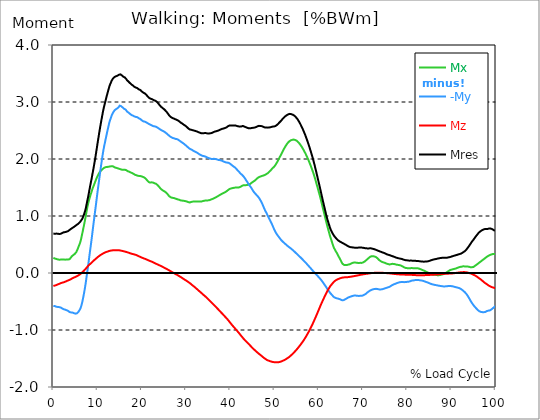
| Category |  Mx |  -My |  Mz |  Mres |
|---|---|---|---|---|
| 0.0 | 0.266 | -0.577 | -0.228 | 0.693 |
| 0.167348456675344 | 0.259 | -0.575 | -0.224 | 0.686 |
| 0.334696913350688 | 0.253 | -0.58 | -0.22 | 0.688 |
| 0.5020453700260321 | 0.25 | -0.586 | -0.216 | 0.69 |
| 0.669393826701376 | 0.247 | -0.592 | -0.211 | 0.692 |
| 0.83674228337672 | 0.243 | -0.594 | -0.206 | 0.691 |
| 1.0040907400520642 | 0.239 | -0.596 | -0.2 | 0.689 |
| 1.1621420602454444 | 0.233 | -0.599 | -0.196 | 0.688 |
| 1.3294905169207885 | 0.233 | -0.599 | -0.19 | 0.684 |
| 1.4968389735961325 | 0.235 | -0.601 | -0.183 | 0.685 |
| 1.6641874302714765 | 0.235 | -0.605 | -0.178 | 0.688 |
| 1.8315358869468206 | 0.235 | -0.612 | -0.174 | 0.693 |
| 1.9988843436221646 | 0.239 | -0.622 | -0.17 | 0.702 |
| 2.1662328002975086 | 0.236 | -0.63 | -0.168 | 0.708 |
| 2.333581256972853 | 0.235 | -0.636 | -0.164 | 0.714 |
| 2.5009297136481967 | 0.234 | -0.64 | -0.158 | 0.716 |
| 2.6682781703235405 | 0.234 | -0.643 | -0.153 | 0.718 |
| 2.8356266269988843 | 0.234 | -0.648 | -0.147 | 0.721 |
| 3.002975083674229 | 0.235 | -0.653 | -0.142 | 0.725 |
| 3.1703235403495724 | 0.239 | -0.657 | -0.135 | 0.729 |
| 3.337671997024917 | 0.237 | -0.665 | -0.13 | 0.735 |
| 3.4957233172182973 | 0.233 | -0.678 | -0.126 | 0.745 |
| 3.663071773893641 | 0.243 | -0.685 | -0.12 | 0.755 |
| 3.8304202305689854 | 0.259 | -0.689 | -0.112 | 0.766 |
| 3.997768687244329 | 0.275 | -0.692 | -0.106 | 0.775 |
| 4.165117143919673 | 0.293 | -0.693 | -0.099 | 0.784 |
| 4.332465600595017 | 0.304 | -0.695 | -0.092 | 0.793 |
| 4.499814057270361 | 0.314 | -0.698 | -0.085 | 0.799 |
| 4.667162513945706 | 0.323 | -0.705 | -0.079 | 0.809 |
| 4.834510970621049 | 0.334 | -0.709 | -0.074 | 0.819 |
| 5.001859427296393 | 0.349 | -0.714 | -0.069 | 0.829 |
| 5.169207883971737 | 0.365 | -0.715 | -0.062 | 0.839 |
| 5.336556340647081 | 0.392 | -0.707 | -0.056 | 0.848 |
| 5.503904797322425 | 0.422 | -0.696 | -0.049 | 0.856 |
| 5.671253253997769 | 0.455 | -0.68 | -0.041 | 0.866 |
| 5.82930457419115 | 0.489 | -0.664 | -0.032 | 0.879 |
| 5.996653030866494 | 0.522 | -0.641 | -0.024 | 0.892 |
| 6.164001487541838 | 0.562 | -0.614 | -0.015 | 0.908 |
| 6.331349944217181 | 0.62 | -0.571 | -0.004 | 0.927 |
| 6.498698400892526 | 0.68 | -0.522 | 0.008 | 0.946 |
| 6.66604685756787 | 0.741 | -0.463 | 0.022 | 0.975 |
| 6.833395314243213 | 0.804 | -0.396 | 0.035 | 1.007 |
| 7.000743770918558 | 0.868 | -0.326 | 0.048 | 1.045 |
| 7.168092227593902 | 0.933 | -0.249 | 0.061 | 1.088 |
| 7.335440684269246 | 1.003 | -0.166 | 0.076 | 1.136 |
| 7.50278914094459 | 1.077 | -0.072 | 0.092 | 1.201 |
| 7.6701375976199335 | 1.148 | 0.021 | 0.107 | 1.266 |
| 7.837486054295278 | 1.207 | 0.114 | 0.122 | 1.325 |
| 7.995537374488658 | 1.26 | 0.211 | 0.136 | 1.392 |
| 8.162885831164003 | 1.308 | 0.312 | 0.149 | 1.464 |
| 8.330234287839346 | 1.352 | 0.408 | 0.159 | 1.531 |
| 8.49758274451469 | 1.393 | 0.505 | 0.171 | 1.597 |
| 8.664931201190035 | 1.431 | 0.606 | 0.182 | 1.662 |
| 8.832279657865378 | 1.475 | 0.711 | 0.196 | 1.734 |
| 8.999628114540721 | 1.509 | 0.818 | 0.208 | 1.803 |
| 9.166976571216066 | 1.541 | 0.92 | 0.221 | 1.876 |
| 9.334325027891412 | 1.575 | 1.021 | 0.232 | 1.952 |
| 9.501673484566755 | 1.61 | 1.121 | 0.244 | 2.029 |
| 9.669021941242098 | 1.643 | 1.223 | 0.254 | 2.111 |
| 9.836370397917442 | 1.674 | 1.328 | 0.266 | 2.196 |
| 10.003718854592787 | 1.702 | 1.431 | 0.277 | 2.28 |
| 10.17106731126813 | 1.727 | 1.529 | 0.286 | 2.361 |
| 10.329118631461512 | 1.751 | 1.626 | 0.297 | 2.442 |
| 10.496467088136853 | 1.773 | 1.724 | 0.306 | 2.521 |
| 10.663815544812199 | 1.79 | 1.819 | 0.316 | 2.597 |
| 10.831164001487544 | 1.802 | 1.91 | 0.323 | 2.67 |
| 10.998512458162887 | 1.814 | 1.998 | 0.331 | 2.741 |
| 11.16586091483823 | 1.825 | 2.084 | 0.34 | 2.81 |
| 11.333209371513574 | 1.838 | 2.162 | 0.347 | 2.875 |
| 11.50055782818892 | 1.847 | 2.229 | 0.354 | 2.931 |
| 11.667906284864264 | 1.853 | 2.292 | 0.359 | 2.983 |
| 11.835254741539607 | 1.857 | 2.353 | 0.365 | 3.035 |
| 12.00260319821495 | 1.859 | 2.414 | 0.37 | 3.084 |
| 12.169951654890292 | 1.86 | 2.474 | 0.374 | 3.134 |
| 12.337300111565641 | 1.862 | 2.531 | 0.378 | 3.181 |
| 12.504648568240984 | 1.865 | 2.589 | 0.383 | 3.228 |
| 12.662699888434362 | 1.868 | 2.643 | 0.388 | 3.274 |
| 12.830048345109708 | 1.87 | 2.685 | 0.391 | 3.309 |
| 12.997396801785053 | 1.873 | 2.72 | 0.394 | 3.339 |
| 13.164745258460396 | 1.873 | 2.76 | 0.396 | 3.372 |
| 13.33209371513574 | 1.874 | 2.786 | 0.397 | 3.394 |
| 13.499442171811083 | 1.871 | 2.815 | 0.398 | 3.415 |
| 13.666790628486426 | 1.862 | 2.834 | 0.399 | 3.428 |
| 13.834139085161771 | 1.854 | 2.854 | 0.4 | 3.44 |
| 14.001487541837117 | 1.85 | 2.864 | 0.4 | 3.445 |
| 14.16883599851246 | 1.846 | 2.874 | 0.401 | 3.451 |
| 14.336184455187803 | 1.841 | 2.886 | 0.401 | 3.458 |
| 14.503532911863147 | 1.839 | 2.892 | 0.4 | 3.462 |
| 14.670881368538492 | 1.832 | 2.898 | 0.398 | 3.464 |
| 14.828932688731873 | 1.829 | 2.917 | 0.398 | 3.478 |
| 14.996281145407215 | 1.827 | 2.936 | 0.397 | 3.494 |
| 15.163629602082558 | 1.821 | 2.931 | 0.395 | 3.485 |
| 15.330978058757903 | 1.814 | 2.926 | 0.392 | 3.477 |
| 15.498326515433247 | 1.812 | 2.916 | 0.389 | 3.467 |
| 15.665674972108594 | 1.81 | 2.904 | 0.385 | 3.455 |
| 15.833023428783937 | 1.81 | 2.891 | 0.382 | 3.443 |
| 16.00037188545928 | 1.811 | 2.879 | 0.379 | 3.432 |
| 16.167720342134626 | 1.811 | 2.876 | 0.376 | 3.43 |
| 16.335068798809967 | 1.809 | 2.868 | 0.373 | 3.421 |
| 16.502417255485312 | 1.803 | 2.85 | 0.369 | 3.401 |
| 16.669765712160658 | 1.794 | 2.832 | 0.365 | 3.381 |
| 16.837114168836 | 1.785 | 2.824 | 0.361 | 3.369 |
| 17.004462625511344 | 1.782 | 2.814 | 0.356 | 3.357 |
| 17.16251394570472 | 1.777 | 2.803 | 0.352 | 3.346 |
| 17.32986240238007 | 1.771 | 2.792 | 0.347 | 3.331 |
| 17.497210859055414 | 1.764 | 2.778 | 0.342 | 3.316 |
| 17.664559315730756 | 1.758 | 2.772 | 0.339 | 3.306 |
| 17.8319077724061 | 1.752 | 2.769 | 0.335 | 3.3 |
| 17.999256229081443 | 1.747 | 2.76 | 0.332 | 3.289 |
| 18.166604685756788 | 1.738 | 2.753 | 0.329 | 3.277 |
| 18.333953142432133 | 1.727 | 2.747 | 0.325 | 3.266 |
| 18.501301599107478 | 1.722 | 2.742 | 0.322 | 3.258 |
| 18.668650055782823 | 1.718 | 2.738 | 0.318 | 3.252 |
| 18.835998512458165 | 1.714 | 2.742 | 0.312 | 3.253 |
| 19.00334696913351 | 1.708 | 2.733 | 0.306 | 3.243 |
| 19.170695425808855 | 1.704 | 2.723 | 0.3 | 3.231 |
| 19.338043882484197 | 1.701 | 2.714 | 0.294 | 3.221 |
| 19.496095202677576 | 1.703 | 2.708 | 0.288 | 3.217 |
| 19.66344365935292 | 1.702 | 2.701 | 0.281 | 3.21 |
| 19.830792116028263 | 1.698 | 2.691 | 0.275 | 3.199 |
| 19.998140572703612 | 1.693 | 2.678 | 0.27 | 3.184 |
| 20.165489029378953 | 1.689 | 2.668 | 0.265 | 3.174 |
| 20.3328374860543 | 1.683 | 2.66 | 0.259 | 3.165 |
| 20.500185942729644 | 1.678 | 2.658 | 0.255 | 3.158 |
| 20.667534399404985 | 1.671 | 2.655 | 0.25 | 3.151 |
| 20.83488285608033 | 1.659 | 2.653 | 0.245 | 3.143 |
| 21.002231312755672 | 1.645 | 2.644 | 0.24 | 3.127 |
| 21.16957976943102 | 1.629 | 2.635 | 0.233 | 3.111 |
| 21.336928226106362 | 1.614 | 2.627 | 0.228 | 3.097 |
| 21.504276682781704 | 1.6 | 2.619 | 0.222 | 3.082 |
| 21.67162513945705 | 1.591 | 2.611 | 0.217 | 3.071 |
| 21.82967645965043 | 1.586 | 2.605 | 0.211 | 3.062 |
| 21.997024916325774 | 1.585 | 2.599 | 0.206 | 3.057 |
| 22.16437337300112 | 1.591 | 2.593 | 0.201 | 3.054 |
| 22.33172182967646 | 1.594 | 2.586 | 0.196 | 3.049 |
| 22.499070286351806 | 1.588 | 2.578 | 0.19 | 3.039 |
| 22.666418743027148 | 1.581 | 2.575 | 0.183 | 3.033 |
| 22.833767199702496 | 1.576 | 2.573 | 0.177 | 3.028 |
| 23.00111565637784 | 1.572 | 2.571 | 0.171 | 3.024 |
| 23.168464113053183 | 1.567 | 2.568 | 0.165 | 3.019 |
| 23.335812569728528 | 1.557 | 2.561 | 0.158 | 3.008 |
| 23.50316102640387 | 1.547 | 2.554 | 0.152 | 2.995 |
| 23.670509483079215 | 1.533 | 2.545 | 0.147 | 2.98 |
| 23.83785793975456 | 1.519 | 2.536 | 0.141 | 2.965 |
| 23.995909259947936 | 1.502 | 2.527 | 0.134 | 2.948 |
| 24.163257716623285 | 1.488 | 2.518 | 0.128 | 2.932 |
| 24.330606173298627 | 1.473 | 2.509 | 0.123 | 2.918 |
| 24.49795462997397 | 1.462 | 2.503 | 0.116 | 2.906 |
| 24.665303086649313 | 1.453 | 2.497 | 0.109 | 2.896 |
| 24.83265154332466 | 1.445 | 2.49 | 0.102 | 2.884 |
| 25.0 | 1.439 | 2.483 | 0.096 | 2.876 |
| 25.167348456675345 | 1.43 | 2.475 | 0.09 | 2.865 |
| 25.334696913350694 | 1.42 | 2.465 | 0.082 | 2.85 |
| 25.502045370026035 | 1.409 | 2.454 | 0.076 | 2.835 |
| 25.669393826701377 | 1.397 | 2.444 | 0.069 | 2.821 |
| 25.836742283376722 | 1.382 | 2.432 | 0.061 | 2.803 |
| 26.004090740052067 | 1.366 | 2.421 | 0.054 | 2.785 |
| 26.17143919672741 | 1.349 | 2.409 | 0.047 | 2.766 |
| 26.329490516920792 | 1.336 | 2.398 | 0.04 | 2.75 |
| 26.49683897359613 | 1.33 | 2.389 | 0.031 | 2.74 |
| 26.66418743027148 | 1.324 | 2.382 | 0.024 | 2.73 |
| 26.831535886946828 | 1.32 | 2.375 | 0.017 | 2.723 |
| 26.998884343622166 | 1.318 | 2.369 | 0.008 | 2.717 |
| 27.166232800297514 | 1.317 | 2.365 | 0.001 | 2.711 |
| 27.333581256972852 | 1.312 | 2.361 | -0.005 | 2.706 |
| 27.5009297136482 | 1.308 | 2.357 | -0.014 | 2.7 |
| 27.668278170323543 | 1.306 | 2.351 | -0.021 | 2.694 |
| 27.835626626998888 | 1.299 | 2.35 | -0.026 | 2.689 |
| 28.002975083674233 | 1.295 | 2.348 | -0.033 | 2.684 |
| 28.170323540349575 | 1.291 | 2.342 | -0.041 | 2.677 |
| 28.33767199702492 | 1.286 | 2.332 | -0.049 | 2.668 |
| 28.50502045370026 | 1.283 | 2.323 | -0.057 | 2.658 |
| 28.663071773893645 | 1.278 | 2.314 | -0.065 | 2.648 |
| 28.830420230568986 | 1.272 | 2.304 | -0.073 | 2.636 |
| 28.99776868724433 | 1.27 | 2.295 | -0.081 | 2.628 |
| 29.165117143919673 | 1.27 | 2.285 | -0.091 | 2.621 |
| 29.33246560059502 | 1.273 | 2.277 | -0.099 | 2.615 |
| 29.499814057270367 | 1.267 | 2.265 | -0.107 | 2.601 |
| 29.66716251394571 | 1.264 | 2.257 | -0.116 | 2.594 |
| 29.834510970621054 | 1.261 | 2.248 | -0.123 | 2.584 |
| 30.00185942729639 | 1.257 | 2.235 | -0.131 | 2.573 |
| 30.169207883971744 | 1.254 | 2.224 | -0.141 | 2.562 |
| 30.33655634064708 | 1.249 | 2.212 | -0.149 | 2.55 |
| 30.50390479732243 | 1.244 | 2.2 | -0.158 | 2.538 |
| 30.671253253997772 | 1.239 | 2.189 | -0.167 | 2.526 |
| 30.829304574191156 | 1.238 | 2.179 | -0.176 | 2.518 |
| 30.996653030866494 | 1.241 | 2.173 | -0.186 | 2.516 |
| 31.164001487541842 | 1.246 | 2.167 | -0.198 | 2.514 |
| 31.331349944217187 | 1.25 | 2.16 | -0.208 | 2.511 |
| 31.498698400892525 | 1.252 | 2.151 | -0.219 | 2.505 |
| 31.666046857567874 | 1.253 | 2.143 | -0.229 | 2.501 |
| 31.833395314243212 | 1.254 | 2.138 | -0.24 | 2.498 |
| 32.00074377091856 | 1.255 | 2.131 | -0.25 | 2.495 |
| 32.1680922275939 | 1.255 | 2.125 | -0.261 | 2.491 |
| 32.33544068426925 | 1.256 | 2.118 | -0.273 | 2.486 |
| 32.50278914094459 | 1.256 | 2.11 | -0.284 | 2.482 |
| 32.670137597619934 | 1.255 | 2.102 | -0.296 | 2.476 |
| 32.83748605429528 | 1.254 | 2.094 | -0.307 | 2.47 |
| 33.004834510970625 | 1.253 | 2.083 | -0.319 | 2.465 |
| 33.162885831164004 | 1.254 | 2.076 | -0.329 | 2.459 |
| 33.33023428783935 | 1.254 | 2.069 | -0.341 | 2.455 |
| 33.497582744514695 | 1.255 | 2.061 | -0.353 | 2.451 |
| 33.664931201190036 | 1.258 | 2.056 | -0.365 | 2.451 |
| 33.83227965786538 | 1.262 | 2.054 | -0.376 | 2.452 |
| 33.99962811454073 | 1.266 | 2.051 | -0.388 | 2.454 |
| 34.16697657121607 | 1.269 | 2.047 | -0.399 | 2.454 |
| 34.33432502789141 | 1.271 | 2.044 | -0.409 | 2.454 |
| 34.50167348456676 | 1.273 | 2.04 | -0.421 | 2.454 |
| 34.6690219412421 | 1.273 | 2.032 | -0.433 | 2.452 |
| 34.83637039791744 | 1.273 | 2.024 | -0.448 | 2.449 |
| 35.00371885459279 | 1.275 | 2.019 | -0.46 | 2.449 |
| 35.17106731126814 | 1.276 | 2.015 | -0.473 | 2.448 |
| 35.338415767943474 | 1.28 | 2.01 | -0.485 | 2.449 |
| 35.49646708813686 | 1.284 | 2.005 | -0.497 | 2.451 |
| 35.6638155448122 | 1.29 | 2.002 | -0.509 | 2.454 |
| 35.831164001487544 | 1.295 | 2 | -0.523 | 2.457 |
| 35.998512458162885 | 1.3 | 2.001 | -0.538 | 2.462 |
| 36.165860914838234 | 1.305 | 2.002 | -0.549 | 2.47 |
| 36.333209371513576 | 1.312 | 2.003 | -0.561 | 2.476 |
| 36.50055782818892 | 1.319 | 2.002 | -0.574 | 2.481 |
| 36.667906284864266 | 1.324 | 1.999 | -0.588 | 2.484 |
| 36.83525474153961 | 1.331 | 1.996 | -0.601 | 2.488 |
| 37.002603198214956 | 1.34 | 1.993 | -0.616 | 2.493 |
| 37.1699516548903 | 1.347 | 1.989 | -0.629 | 2.496 |
| 37.337300111565646 | 1.353 | 1.983 | -0.643 | 2.498 |
| 37.50464856824098 | 1.362 | 1.982 | -0.657 | 2.505 |
| 37.66269988843437 | 1.37 | 1.98 | -0.671 | 2.512 |
| 37.83004834510971 | 1.377 | 1.978 | -0.684 | 2.519 |
| 37.99739680178505 | 1.385 | 1.973 | -0.698 | 2.523 |
| 38.16474525846039 | 1.393 | 1.969 | -0.711 | 2.529 |
| 38.33209371513574 | 1.399 | 1.961 | -0.725 | 2.532 |
| 38.49944217181109 | 1.405 | 1.954 | -0.739 | 2.535 |
| 38.666790628486424 | 1.411 | 1.95 | -0.753 | 2.54 |
| 38.83413908516178 | 1.418 | 1.945 | -0.768 | 2.544 |
| 39.001487541837115 | 1.425 | 1.941 | -0.781 | 2.55 |
| 39.16883599851246 | 1.434 | 1.938 | -0.795 | 2.556 |
| 39.336184455187805 | 1.444 | 1.936 | -0.809 | 2.566 |
| 39.503532911863154 | 1.455 | 1.935 | -0.825 | 2.576 |
| 39.670881368538495 | 1.467 | 1.931 | -0.841 | 2.585 |
| 39.83822982521384 | 1.474 | 1.924 | -0.857 | 2.589 |
| 39.996281145407224 | 1.479 | 1.915 | -0.874 | 2.59 |
| 40.163629602082565 | 1.482 | 1.904 | -0.89 | 2.59 |
| 40.33097805875791 | 1.488 | 1.894 | -0.906 | 2.591 |
| 40.498326515433256 | 1.49 | 1.883 | -0.922 | 2.59 |
| 40.6656749721086 | 1.492 | 1.873 | -0.936 | 2.589 |
| 40.83302342878393 | 1.495 | 1.862 | -0.952 | 2.589 |
| 41.00037188545929 | 1.499 | 1.855 | -0.966 | 2.591 |
| 41.16772034213463 | 1.499 | 1.843 | -0.981 | 2.588 |
| 41.33506879880997 | 1.499 | 1.829 | -0.996 | 2.583 |
| 41.50241725548531 | 1.499 | 1.815 | -1.01 | 2.579 |
| 41.66976571216066 | 1.499 | 1.801 | -1.026 | 2.575 |
| 41.837114168836 | 1.5 | 1.788 | -1.041 | 2.573 |
| 42.004462625511344 | 1.503 | 1.774 | -1.056 | 2.571 |
| 42.17181108218669 | 1.506 | 1.758 | -1.073 | 2.568 |
| 42.32986240238007 | 1.512 | 1.743 | -1.09 | 2.567 |
| 42.497210859055414 | 1.521 | 1.731 | -1.105 | 2.571 |
| 42.66455931573076 | 1.529 | 1.722 | -1.121 | 2.576 |
| 42.831907772406105 | 1.536 | 1.711 | -1.136 | 2.58 |
| 42.999256229081446 | 1.539 | 1.694 | -1.152 | 2.575 |
| 43.16660468575679 | 1.54 | 1.676 | -1.167 | 2.57 |
| 43.33395314243214 | 1.54 | 1.658 | -1.18 | 2.565 |
| 43.50130159910748 | 1.541 | 1.638 | -1.194 | 2.558 |
| 43.66865005578282 | 1.542 | 1.618 | -1.207 | 2.553 |
| 43.83599851245817 | 1.544 | 1.599 | -1.22 | 2.548 |
| 44.00334696913351 | 1.547 | 1.577 | -1.232 | 2.543 |
| 44.17069542580886 | 1.551 | 1.556 | -1.246 | 2.539 |
| 44.3380438824842 | 1.555 | 1.538 | -1.258 | 2.536 |
| 44.49609520267758 | 1.562 | 1.521 | -1.272 | 2.538 |
| 44.66344365935292 | 1.572 | 1.503 | -1.286 | 2.541 |
| 44.83079211602827 | 1.583 | 1.483 | -1.301 | 2.544 |
| 44.99814057270361 | 1.594 | 1.461 | -1.314 | 2.546 |
| 45.16548902937895 | 1.602 | 1.442 | -1.327 | 2.548 |
| 45.332837486054295 | 1.609 | 1.422 | -1.339 | 2.548 |
| 45.500185942729644 | 1.619 | 1.405 | -1.351 | 2.551 |
| 45.66753439940499 | 1.629 | 1.392 | -1.362 | 2.555 |
| 45.83488285608033 | 1.641 | 1.377 | -1.374 | 2.56 |
| 46.00223131275568 | 1.653 | 1.362 | -1.385 | 2.567 |
| 46.16957976943102 | 1.666 | 1.35 | -1.397 | 2.574 |
| 46.336928226106366 | 1.674 | 1.334 | -1.408 | 2.577 |
| 46.50427668278171 | 1.683 | 1.319 | -1.419 | 2.581 |
| 46.671625139457056 | 1.691 | 1.298 | -1.429 | 2.583 |
| 46.829676459650436 | 1.693 | 1.274 | -1.439 | 2.58 |
| 46.99702491632577 | 1.698 | 1.25 | -1.449 | 2.576 |
| 47.16437337300112 | 1.703 | 1.225 | -1.46 | 2.575 |
| 47.33172182967646 | 1.707 | 1.196 | -1.472 | 2.571 |
| 47.49907028635181 | 1.71 | 1.165 | -1.483 | 2.564 |
| 47.66641874302716 | 1.716 | 1.134 | -1.493 | 2.558 |
| 47.83376719970249 | 1.72 | 1.105 | -1.502 | 2.553 |
| 48.001115656377834 | 1.727 | 1.079 | -1.51 | 2.552 |
| 48.16846411305319 | 1.736 | 1.056 | -1.519 | 2.554 |
| 48.33581256972853 | 1.746 | 1.028 | -1.528 | 2.552 |
| 48.50316102640387 | 1.751 | 1.002 | -1.532 | 2.55 |
| 48.67050948307921 | 1.764 | 0.975 | -1.538 | 2.552 |
| 48.837857939754564 | 1.777 | 0.95 | -1.542 | 2.554 |
| 49.005206396429905 | 1.791 | 0.925 | -1.547 | 2.557 |
| 49.163257716623285 | 1.802 | 0.898 | -1.55 | 2.558 |
| 49.33060617329863 | 1.819 | 0.873 | -1.555 | 2.562 |
| 49.49795462997397 | 1.834 | 0.843 | -1.559 | 2.568 |
| 49.66530308664932 | 1.847 | 0.812 | -1.562 | 2.569 |
| 49.832651543324666 | 1.857 | 0.782 | -1.564 | 2.569 |
| 50.0 | 1.873 | 0.754 | -1.565 | 2.572 |
| 50.16734845667534 | 1.89 | 0.728 | -1.566 | 2.577 |
| 50.33469691335069 | 1.91 | 0.704 | -1.567 | 2.584 |
| 50.50204537002604 | 1.932 | 0.683 | -1.567 | 2.594 |
| 50.66939382670139 | 1.954 | 0.665 | -1.566 | 2.606 |
| 50.836742283376715 | 1.978 | 0.647 | -1.565 | 2.618 |
| 51.00409074005207 | 2.003 | 0.63 | -1.564 | 2.631 |
| 51.17143919672741 | 2.03 | 0.614 | -1.56 | 2.646 |
| 51.32949051692079 | 2.055 | 0.597 | -1.557 | 2.66 |
| 51.496838973596134 | 2.078 | 0.578 | -1.553 | 2.672 |
| 51.66418743027148 | 2.103 | 0.565 | -1.548 | 2.686 |
| 51.831535886946824 | 2.132 | 0.553 | -1.542 | 2.703 |
| 51.99888434362217 | 2.155 | 0.54 | -1.535 | 2.715 |
| 52.16623280029752 | 2.181 | 0.528 | -1.53 | 2.73 |
| 52.33358125697285 | 2.204 | 0.518 | -1.524 | 2.743 |
| 52.5009297136482 | 2.225 | 0.506 | -1.516 | 2.753 |
| 52.668278170323546 | 2.246 | 0.495 | -1.507 | 2.764 |
| 52.835626626998895 | 2.265 | 0.483 | -1.5 | 2.772 |
| 53.00297508367424 | 2.282 | 0.474 | -1.491 | 2.78 |
| 53.17032354034958 | 2.298 | 0.461 | -1.482 | 2.785 |
| 53.33767199702492 | 2.309 | 0.451 | -1.473 | 2.789 |
| 53.50502045370027 | 2.322 | 0.443 | -1.462 | 2.792 |
| 53.663071773893655 | 2.327 | 0.432 | -1.45 | 2.789 |
| 53.83042023056899 | 2.332 | 0.422 | -1.439 | 2.785 |
| 53.99776868724433 | 2.335 | 0.41 | -1.426 | 2.78 |
| 54.16511714391967 | 2.34 | 0.4 | -1.414 | 2.776 |
| 54.33246560059503 | 2.341 | 0.389 | -1.4 | 2.769 |
| 54.49981405727037 | 2.339 | 0.376 | -1.386 | 2.759 |
| 54.667162513945705 | 2.334 | 0.364 | -1.373 | 2.747 |
| 54.834510970621054 | 2.328 | 0.351 | -1.358 | 2.733 |
| 55.0018594272964 | 2.322 | 0.34 | -1.344 | 2.72 |
| 55.169207883971744 | 2.311 | 0.328 | -1.328 | 2.703 |
| 55.336556340647086 | 2.298 | 0.316 | -1.312 | 2.682 |
| 55.50390479732243 | 2.284 | 0.302 | -1.297 | 2.661 |
| 55.671253253997776 | 2.269 | 0.29 | -1.28 | 2.64 |
| 55.83860171067312 | 2.251 | 0.277 | -1.264 | 2.615 |
| 55.9966530308665 | 2.232 | 0.265 | -1.246 | 2.589 |
| 56.16400148754184 | 2.212 | 0.252 | -1.228 | 2.562 |
| 56.33134994421718 | 2.192 | 0.239 | -1.21 | 2.534 |
| 56.498698400892536 | 2.169 | 0.225 | -1.192 | 2.505 |
| 56.66604685756788 | 2.145 | 0.211 | -1.172 | 2.474 |
| 56.83339531424321 | 2.121 | 0.198 | -1.152 | 2.443 |
| 57.00074377091856 | 2.097 | 0.184 | -1.131 | 2.41 |
| 57.16809222759391 | 2.069 | 0.172 | -1.109 | 2.374 |
| 57.33544068426925 | 2.042 | 0.157 | -1.086 | 2.339 |
| 57.5027891409446 | 2.013 | 0.142 | -1.065 | 2.302 |
| 57.670137597619934 | 1.983 | 0.127 | -1.041 | 2.265 |
| 57.83748605429528 | 1.952 | 0.114 | -1.017 | 2.225 |
| 58.004834510970625 | 1.92 | 0.099 | -0.992 | 2.184 |
| 58.16288583116401 | 1.886 | 0.084 | -0.967 | 2.143 |
| 58.330234287839346 | 1.852 | 0.069 | -0.941 | 2.1 |
| 58.497582744514695 | 1.817 | 0.054 | -0.914 | 2.056 |
| 58.66493120119004 | 1.779 | 0.04 | -0.886 | 2.01 |
| 58.832279657865385 | 1.742 | 0.025 | -0.857 | 1.962 |
| 58.999628114540734 | 1.7 | 0.01 | -0.828 | 1.914 |
| 59.16697657121607 | 1.657 | -0.004 | -0.799 | 1.861 |
| 59.33432502789142 | 1.612 | -0.018 | -0.77 | 1.808 |
| 59.50167348456676 | 1.566 | -0.031 | -0.74 | 1.753 |
| 59.66902194124211 | 1.521 | -0.045 | -0.709 | 1.7 |
| 59.83637039791745 | 1.474 | -0.058 | -0.678 | 1.644 |
| 60.00371885459278 | 1.426 | -0.073 | -0.647 | 1.588 |
| 60.17106731126813 | 1.38 | -0.088 | -0.616 | 1.533 |
| 60.33841576794349 | 1.331 | -0.101 | -0.584 | 1.477 |
| 60.49646708813685 | 1.28 | -0.117 | -0.554 | 1.42 |
| 60.6638155448122 | 1.225 | -0.133 | -0.525 | 1.36 |
| 60.831164001487544 | 1.173 | -0.151 | -0.497 | 1.304 |
| 60.99851245816289 | 1.12 | -0.17 | -0.469 | 1.247 |
| 61.16586091483824 | 1.067 | -0.189 | -0.441 | 1.192 |
| 61.333209371513576 | 1.014 | -0.207 | -0.414 | 1.136 |
| 61.50055782818892 | 0.96 | -0.225 | -0.388 | 1.082 |
| 61.667906284864266 | 0.906 | -0.245 | -0.36 | 1.027 |
| 61.835254741539615 | 0.854 | -0.266 | -0.334 | 0.976 |
| 62.002603198214956 | 0.805 | -0.285 | -0.309 | 0.93 |
| 62.16995165489029 | 0.758 | -0.303 | -0.288 | 0.889 |
| 62.33730011156564 | 0.711 | -0.323 | -0.266 | 0.847 |
| 62.504648568240995 | 0.664 | -0.341 | -0.245 | 0.806 |
| 62.67199702491633 | 0.62 | -0.358 | -0.225 | 0.769 |
| 62.83004834510971 | 0.582 | -0.37 | -0.21 | 0.743 |
| 62.99739680178505 | 0.542 | -0.384 | -0.194 | 0.716 |
| 63.1647452584604 | 0.5 | -0.401 | -0.178 | 0.691 |
| 63.33209371513575 | 0.463 | -0.417 | -0.162 | 0.669 |
| 63.4994421718111 | 0.432 | -0.427 | -0.149 | 0.649 |
| 63.666790628486424 | 0.409 | -0.432 | -0.139 | 0.634 |
| 63.83413908516177 | 0.384 | -0.441 | -0.128 | 0.618 |
| 64.00148754183712 | 0.364 | -0.443 | -0.121 | 0.604 |
| 64.16883599851248 | 0.342 | -0.445 | -0.115 | 0.589 |
| 64.3361844551878 | 0.315 | -0.449 | -0.108 | 0.575 |
| 64.50353291186315 | 0.29 | -0.453 | -0.103 | 0.566 |
| 64.6708813685385 | 0.268 | -0.456 | -0.098 | 0.557 |
| 64.83822982521384 | 0.243 | -0.461 | -0.093 | 0.55 |
| 65.00557828188919 | 0.219 | -0.468 | -0.089 | 0.544 |
| 65.16362960208257 | 0.192 | -0.474 | -0.084 | 0.535 |
| 65.3309780587579 | 0.167 | -0.479 | -0.081 | 0.527 |
| 65.49832651543326 | 0.152 | -0.478 | -0.079 | 0.522 |
| 65.6656749721086 | 0.144 | -0.475 | -0.077 | 0.516 |
| 65.83302342878395 | 0.141 | -0.468 | -0.077 | 0.507 |
| 66.00037188545929 | 0.139 | -0.46 | -0.076 | 0.5 |
| 66.16772034213463 | 0.138 | -0.453 | -0.076 | 0.493 |
| 66.33506879880998 | 0.139 | -0.446 | -0.075 | 0.484 |
| 66.50241725548531 | 0.143 | -0.438 | -0.074 | 0.476 |
| 66.66976571216065 | 0.147 | -0.43 | -0.072 | 0.469 |
| 66.83711416883601 | 0.15 | -0.424 | -0.07 | 0.463 |
| 67.00446262551135 | 0.152 | -0.42 | -0.068 | 0.458 |
| 67.1718110821867 | 0.155 | -0.416 | -0.066 | 0.454 |
| 67.32986240238007 | 0.167 | -0.41 | -0.065 | 0.452 |
| 67.49721085905541 | 0.173 | -0.406 | -0.061 | 0.451 |
| 67.66455931573076 | 0.178 | -0.402 | -0.059 | 0.449 |
| 67.83190777240611 | 0.182 | -0.399 | -0.057 | 0.447 |
| 67.99925622908145 | 0.184 | -0.396 | -0.055 | 0.445 |
| 68.16660468575678 | 0.184 | -0.395 | -0.052 | 0.444 |
| 68.33395314243214 | 0.182 | -0.396 | -0.05 | 0.444 |
| 68.50130159910749 | 0.18 | -0.398 | -0.048 | 0.445 |
| 68.66865005578282 | 0.179 | -0.399 | -0.045 | 0.445 |
| 68.83599851245816 | 0.177 | -0.4 | -0.043 | 0.445 |
| 69.00334696913352 | 0.175 | -0.402 | -0.04 | 0.446 |
| 69.17069542580886 | 0.175 | -0.402 | -0.036 | 0.446 |
| 69.3380438824842 | 0.178 | -0.401 | -0.033 | 0.446 |
| 69.50539233915956 | 0.177 | -0.401 | -0.031 | 0.447 |
| 69.66344365935292 | 0.177 | -0.401 | -0.028 | 0.447 |
| 69.83079211602826 | 0.179 | -0.398 | -0.026 | 0.445 |
| 69.99814057270362 | 0.184 | -0.394 | -0.024 | 0.443 |
| 70.16548902937896 | 0.192 | -0.388 | -0.022 | 0.441 |
| 70.33283748605429 | 0.199 | -0.38 | -0.02 | 0.439 |
| 70.50018594272964 | 0.208 | -0.373 | -0.018 | 0.435 |
| 70.667534399405 | 0.22 | -0.365 | -0.016 | 0.434 |
| 70.83488285608033 | 0.23 | -0.354 | -0.014 | 0.432 |
| 71.00223131275568 | 0.243 | -0.342 | -0.012 | 0.432 |
| 71.16957976943102 | 0.254 | -0.331 | -0.01 | 0.431 |
| 71.33692822610637 | 0.266 | -0.322 | -0.008 | 0.431 |
| 71.50427668278171 | 0.276 | -0.314 | -0.006 | 0.432 |
| 71.67162513945706 | 0.286 | -0.305 | -0.004 | 0.432 |
| 71.8389735961324 | 0.292 | -0.3 | -0.002 | 0.432 |
| 71.99702491632577 | 0.295 | -0.294 | -0.001 | 0.429 |
| 72.16437337300113 | 0.295 | -0.289 | 0.001 | 0.426 |
| 72.33172182967647 | 0.294 | -0.285 | 0.001 | 0.423 |
| 72.49907028635181 | 0.292 | -0.282 | 0.002 | 0.419 |
| 72.66641874302715 | 0.289 | -0.279 | 0.003 | 0.415 |
| 72.8337671997025 | 0.284 | -0.278 | 0.004 | 0.41 |
| 73.00111565637783 | 0.277 | -0.278 | 0.004 | 0.405 |
| 73.16846411305319 | 0.267 | -0.279 | 0.004 | 0.399 |
| 73.33581256972853 | 0.254 | -0.282 | 0.004 | 0.394 |
| 73.50316102640387 | 0.239 | -0.285 | 0.005 | 0.389 |
| 73.67050948307921 | 0.227 | -0.288 | 0.005 | 0.383 |
| 73.83785793975457 | 0.217 | -0.289 | 0.005 | 0.378 |
| 74.00520639642991 | 0.208 | -0.289 | 0.004 | 0.374 |
| 74.16325771662328 | 0.202 | -0.288 | 0.004 | 0.369 |
| 74.33060617329863 | 0.194 | -0.285 | 0.003 | 0.362 |
| 74.49795462997398 | 0.19 | -0.281 | 0.002 | 0.358 |
| 74.66530308664932 | 0.185 | -0.277 | 0.002 | 0.354 |
| 74.83265154332466 | 0.182 | -0.272 | 0.001 | 0.35 |
| 75.00000000000001 | 0.177 | -0.269 | 0 | 0.343 |
| 75.16734845667534 | 0.17 | -0.265 | -0.001 | 0.336 |
| 75.3346969133507 | 0.165 | -0.26 | -0.002 | 0.33 |
| 75.50204537002605 | 0.16 | -0.256 | -0.002 | 0.325 |
| 75.66939382670138 | 0.157 | -0.251 | -0.004 | 0.321 |
| 75.83674228337672 | 0.153 | -0.247 | -0.005 | 0.318 |
| 76.00409074005208 | 0.15 | -0.243 | -0.006 | 0.314 |
| 76.17143919672742 | 0.151 | -0.235 | -0.008 | 0.309 |
| 76.33878765340276 | 0.155 | -0.226 | -0.009 | 0.304 |
| 76.49683897359614 | 0.158 | -0.218 | -0.01 | 0.299 |
| 76.66418743027148 | 0.16 | -0.21 | -0.012 | 0.295 |
| 76.83153588694682 | 0.16 | -0.204 | -0.014 | 0.291 |
| 76.99888434362218 | 0.159 | -0.198 | -0.016 | 0.286 |
| 77.16623280029752 | 0.156 | -0.194 | -0.017 | 0.281 |
| 77.33358125697285 | 0.152 | -0.189 | -0.018 | 0.276 |
| 77.5009297136482 | 0.147 | -0.183 | -0.02 | 0.27 |
| 77.66827817032356 | 0.145 | -0.178 | -0.021 | 0.266 |
| 77.83562662699889 | 0.143 | -0.173 | -0.022 | 0.262 |
| 78.00297508367423 | 0.142 | -0.169 | -0.023 | 0.259 |
| 78.17032354034959 | 0.14 | -0.165 | -0.024 | 0.256 |
| 78.33767199702493 | 0.136 | -0.161 | -0.025 | 0.253 |
| 78.50502045370027 | 0.134 | -0.159 | -0.026 | 0.251 |
| 78.67236891037561 | 0.128 | -0.158 | -0.027 | 0.248 |
| 78.83042023056899 | 0.121 | -0.159 | -0.027 | 0.245 |
| 78.99776868724433 | 0.114 | -0.159 | -0.028 | 0.241 |
| 79.16511714391969 | 0.106 | -0.16 | -0.028 | 0.235 |
| 79.33246560059503 | 0.099 | -0.16 | -0.028 | 0.231 |
| 79.49981405727036 | 0.093 | -0.159 | -0.028 | 0.227 |
| 79.66716251394571 | 0.089 | -0.158 | -0.029 | 0.224 |
| 79.83451097062107 | 0.086 | -0.155 | -0.029 | 0.223 |
| 80.00185942729641 | 0.085 | -0.155 | -0.029 | 0.223 |
| 80.16920788397174 | 0.083 | -0.154 | -0.03 | 0.221 |
| 80.33655634064709 | 0.082 | -0.152 | -0.03 | 0.219 |
| 80.50390479732243 | 0.081 | -0.148 | -0.031 | 0.217 |
| 80.67125325399778 | 0.083 | -0.145 | -0.031 | 0.217 |
| 80.83860171067312 | 0.086 | -0.139 | -0.032 | 0.218 |
| 80.99665303086651 | 0.088 | -0.134 | -0.032 | 0.219 |
| 81.16400148754184 | 0.085 | -0.133 | -0.033 | 0.217 |
| 81.3313499442172 | 0.084 | -0.131 | -0.034 | 0.216 |
| 81.49869840089255 | 0.084 | -0.128 | -0.035 | 0.215 |
| 81.66604685756786 | 0.085 | -0.126 | -0.036 | 0.215 |
| 81.83339531424322 | 0.085 | -0.124 | -0.036 | 0.214 |
| 82.00074377091858 | 0.084 | -0.123 | -0.038 | 0.212 |
| 82.16809222759392 | 0.083 | -0.123 | -0.038 | 0.211 |
| 82.33544068426926 | 0.083 | -0.122 | -0.039 | 0.21 |
| 82.50278914094459 | 0.08 | -0.123 | -0.039 | 0.209 |
| 82.67013759761994 | 0.077 | -0.125 | -0.039 | 0.207 |
| 82.83748605429528 | 0.073 | -0.127 | -0.039 | 0.206 |
| 83.00483451097062 | 0.068 | -0.129 | -0.039 | 0.204 |
| 83.17218296764597 | 0.062 | -0.131 | -0.039 | 0.202 |
| 83.33023428783935 | 0.056 | -0.133 | -0.039 | 0.201 |
| 83.4975827445147 | 0.051 | -0.136 | -0.039 | 0.2 |
| 83.66493120119004 | 0.046 | -0.14 | -0.039 | 0.199 |
| 83.83227965786537 | 0.04 | -0.144 | -0.038 | 0.199 |
| 83.99962811454073 | 0.034 | -0.149 | -0.038 | 0.201 |
| 84.16697657121607 | 0.027 | -0.154 | -0.038 | 0.201 |
| 84.33432502789142 | 0.02 | -0.158 | -0.036 | 0.201 |
| 84.50167348456677 | 0.014 | -0.164 | -0.036 | 0.202 |
| 84.6690219412421 | 0.008 | -0.168 | -0.035 | 0.204 |
| 84.83637039791745 | 0.002 | -0.173 | -0.034 | 0.208 |
| 85.0037188545928 | -0.005 | -0.179 | -0.034 | 0.212 |
| 85.17106731126813 | -0.015 | -0.184 | -0.033 | 0.217 |
| 85.33841576794349 | -0.02 | -0.19 | -0.032 | 0.221 |
| 85.50576422461883 | -0.024 | -0.194 | -0.031 | 0.226 |
| 85.66381554481221 | -0.026 | -0.198 | -0.03 | 0.23 |
| 85.83116400148755 | -0.027 | -0.202 | -0.03 | 0.234 |
| 85.99851245816289 | -0.028 | -0.204 | -0.029 | 0.237 |
| 86.16586091483823 | -0.029 | -0.207 | -0.028 | 0.241 |
| 86.33320937151358 | -0.031 | -0.21 | -0.027 | 0.243 |
| 86.50055782818893 | -0.033 | -0.211 | -0.026 | 0.245 |
| 86.66790628486427 | -0.036 | -0.215 | -0.025 | 0.248 |
| 86.83525474153961 | -0.039 | -0.218 | -0.024 | 0.252 |
| 87.00260319821496 | -0.04 | -0.221 | -0.024 | 0.255 |
| 87.16995165489031 | -0.039 | -0.223 | -0.023 | 0.257 |
| 87.33730011156564 | -0.036 | -0.225 | -0.022 | 0.26 |
| 87.504648568241 | -0.034 | -0.227 | -0.02 | 0.262 |
| 87.67199702491634 | -0.031 | -0.229 | -0.019 | 0.265 |
| 87.83004834510972 | -0.028 | -0.232 | -0.019 | 0.266 |
| 87.99739680178506 | -0.025 | -0.233 | -0.018 | 0.267 |
| 88.1647452584604 | -0.022 | -0.234 | -0.017 | 0.268 |
| 88.33209371513574 | -0.016 | -0.236 | -0.016 | 0.267 |
| 88.49944217181108 | -0.008 | -0.235 | -0.015 | 0.266 |
| 88.66679062848644 | -0.001 | -0.234 | -0.015 | 0.266 |
| 88.83413908516178 | 0.007 | -0.233 | -0.014 | 0.266 |
| 89.00148754183712 | 0.015 | -0.231 | -0.012 | 0.268 |
| 89.16883599851246 | 0.023 | -0.23 | -0.012 | 0.271 |
| 89.33618445518782 | 0.032 | -0.229 | -0.011 | 0.275 |
| 89.50353291186315 | 0.042 | -0.228 | -0.01 | 0.277 |
| 89.6708813685385 | 0.05 | -0.226 | -0.009 | 0.28 |
| 89.83822982521386 | 0.055 | -0.227 | -0.008 | 0.283 |
| 90.00557828188919 | 0.058 | -0.23 | -0.008 | 0.288 |
| 90.16362960208257 | 0.061 | -0.232 | -0.007 | 0.293 |
| 90.3309780587579 | 0.066 | -0.234 | -0.006 | 0.296 |
| 90.49832651543326 | 0.069 | -0.237 | -0.004 | 0.3 |
| 90.66567497210859 | 0.072 | -0.242 | -0.003 | 0.305 |
| 90.83302342878395 | 0.075 | -0.246 | -0.001 | 0.308 |
| 91.00037188545929 | 0.079 | -0.249 | 0.001 | 0.311 |
| 91.16772034213463 | 0.084 | -0.252 | 0.003 | 0.316 |
| 91.33506879880998 | 0.09 | -0.255 | 0.004 | 0.32 |
| 91.50241725548533 | 0.097 | -0.258 | 0.007 | 0.324 |
| 91.66976571216065 | 0.1 | -0.262 | 0.009 | 0.328 |
| 91.83711416883601 | 0.103 | -0.268 | 0.01 | 0.332 |
| 92.00446262551137 | 0.107 | -0.273 | 0.011 | 0.336 |
| 92.1718110821867 | 0.106 | -0.281 | 0.012 | 0.34 |
| 92.33915953886203 | 0.111 | -0.291 | 0.014 | 0.348 |
| 92.49721085905541 | 0.116 | -0.301 | 0.015 | 0.355 |
| 92.66455931573077 | 0.118 | -0.31 | 0.016 | 0.364 |
| 92.83190777240611 | 0.118 | -0.322 | 0.017 | 0.372 |
| 92.99925622908145 | 0.116 | -0.334 | 0.016 | 0.38 |
| 93.1666046857568 | 0.115 | -0.348 | 0.015 | 0.392 |
| 93.33395314243214 | 0.116 | -0.361 | 0.012 | 0.406 |
| 93.50130159910749 | 0.116 | -0.378 | 0.01 | 0.422 |
| 93.66865005578283 | 0.114 | -0.399 | 0.007 | 0.439 |
| 93.83599851245818 | 0.111 | -0.42 | 0.003 | 0.457 |
| 94.00334696913353 | 0.108 | -0.442 | -0.001 | 0.475 |
| 94.17069542580886 | 0.104 | -0.464 | -0.004 | 0.494 |
| 94.3380438824842 | 0.101 | -0.488 | -0.007 | 0.515 |
| 94.50539233915954 | 0.1 | -0.508 | -0.012 | 0.534 |
| 94.66344365935292 | 0.102 | -0.528 | -0.018 | 0.553 |
| 94.83079211602828 | 0.103 | -0.547 | -0.024 | 0.569 |
| 94.99814057270362 | 0.106 | -0.566 | -0.03 | 0.585 |
| 95.16548902937897 | 0.115 | -0.582 | -0.035 | 0.604 |
| 95.33283748605432 | 0.126 | -0.597 | -0.043 | 0.622 |
| 95.50018594272963 | 0.133 | -0.614 | -0.05 | 0.641 |
| 95.66753439940499 | 0.144 | -0.625 | -0.058 | 0.656 |
| 95.83488285608034 | 0.155 | -0.638 | -0.067 | 0.673 |
| 96.00223131275567 | 0.164 | -0.651 | -0.077 | 0.69 |
| 96.16957976943102 | 0.173 | -0.664 | -0.086 | 0.705 |
| 96.33692822610638 | 0.184 | -0.672 | -0.096 | 0.718 |
| 96.50427668278171 | 0.194 | -0.678 | -0.104 | 0.728 |
| 96.67162513945706 | 0.203 | -0.682 | -0.115 | 0.738 |
| 96.8389735961324 | 0.215 | -0.685 | -0.125 | 0.746 |
| 96.99702491632577 | 0.224 | -0.686 | -0.136 | 0.753 |
| 97.16437337300111 | 0.233 | -0.689 | -0.148 | 0.76 |
| 97.33172182967647 | 0.244 | -0.688 | -0.158 | 0.766 |
| 97.49907028635181 | 0.254 | -0.685 | -0.169 | 0.77 |
| 97.66641874302715 | 0.264 | -0.683 | -0.179 | 0.773 |
| 97.8337671997025 | 0.274 | -0.676 | -0.188 | 0.772 |
| 98.00111565637785 | 0.283 | -0.669 | -0.196 | 0.771 |
| 98.16846411305319 | 0.293 | -0.662 | -0.205 | 0.772 |
| 98.33581256972855 | 0.3 | -0.66 | -0.216 | 0.775 |
| 98.50316102640389 | 0.307 | -0.659 | -0.224 | 0.78 |
| 98.67050948307921 | 0.315 | -0.657 | -0.23 | 0.782 |
| 98.83785793975456 | 0.32 | -0.65 | -0.236 | 0.78 |
| 99.0052063964299 | 0.324 | -0.642 | -0.244 | 0.777 |
| 99.17255485310525 | 0.328 | -0.632 | -0.248 | 0.772 |
| 99.33060617329863 | 0.332 | -0.621 | -0.252 | 0.765 |
| 99.49795462997399 | 0.334 | -0.609 | -0.256 | 0.756 |
| 99.66530308664933 | 0.334 | -0.598 | -0.26 | 0.748 |
| 99.83265154332467 | 0.334 | -0.586 | -0.265 | 0.74 |
| 100.0 | 0.335 | -0.577 | -0.269 | 0.733 |